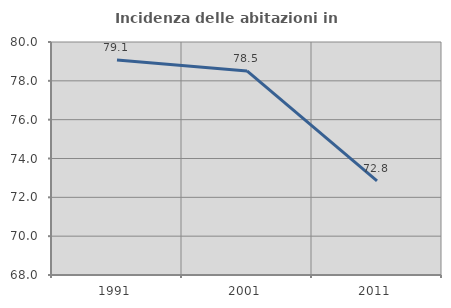
| Category | Incidenza delle abitazioni in proprietà  |
|---|---|
| 1991.0 | 79.078 |
| 2001.0 | 78.509 |
| 2011.0 | 72.848 |